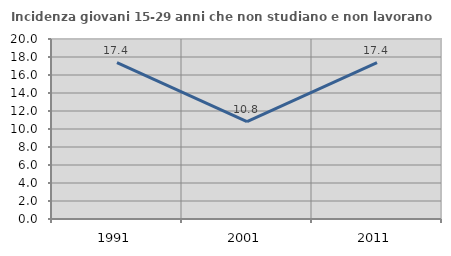
| Category | Incidenza giovani 15-29 anni che non studiano e non lavorano  |
|---|---|
| 1991.0 | 17.37 |
| 2001.0 | 10.812 |
| 2011.0 | 17.371 |